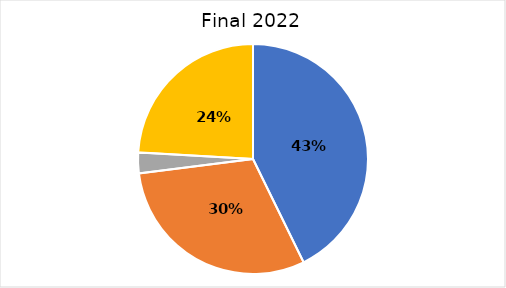
| Category | 2018 |
|---|---|
| Technical Analysis | 0.428 |
| Tool Development and Regional Coordination  | 0.302 |
| Demand Response | 0.029 |
| Administration | 0.241 |